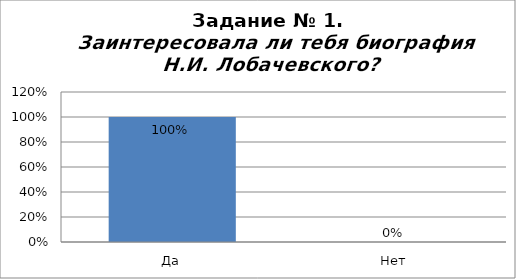
| Category | Да |
|---|---|
| Да | 1 |
| Нет | 0 |